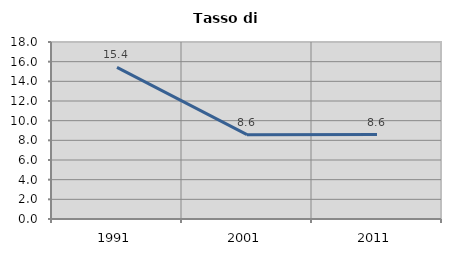
| Category | Tasso di disoccupazione   |
|---|---|
| 1991.0 | 15.422 |
| 2001.0 | 8.578 |
| 2011.0 | 8.585 |